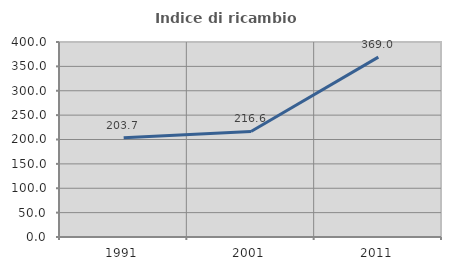
| Category | Indice di ricambio occupazionale  |
|---|---|
| 1991.0 | 203.731 |
| 2001.0 | 216.558 |
| 2011.0 | 368.966 |